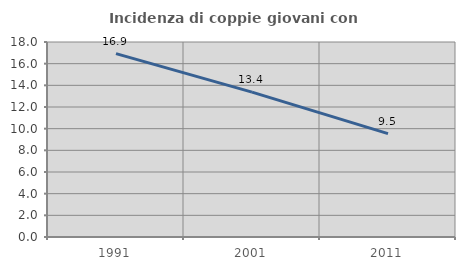
| Category | Incidenza di coppie giovani con figli |
|---|---|
| 1991.0 | 16.923 |
| 2001.0 | 13.376 |
| 2011.0 | 9.548 |